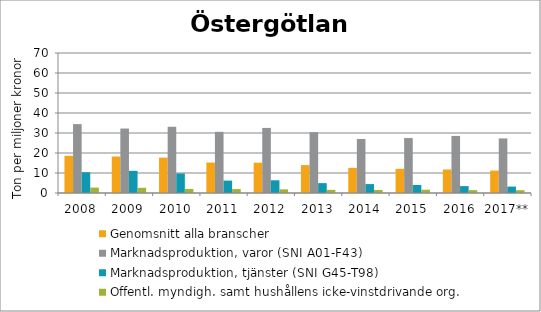
| Category | Genomsnitt alla branscher | Marknadsproduktion, varor (SNI A01-F43) | Marknadsproduktion, tjänster (SNI G45-T98) | Offentl. myndigh. samt hushållens icke-vinstdrivande org. |
|---|---|---|---|---|
| 2008 | 18.607 | 34.447 | 10.396 | 2.703 |
| 2009 | 18.244 | 32.229 | 11.085 | 2.61 |
| 2010 | 17.69 | 33.114 | 9.784 | 2.023 |
| 2011 | 15.23 | 30.583 | 6.197 | 1.975 |
| 2012 | 15.149 | 32.537 | 6.356 | 1.814 |
| 2013 | 13.944 | 30.435 | 4.934 | 1.583 |
| 2014 | 12.571 | 27.001 | 4.464 | 1.518 |
| 2015 | 12.081 | 27.482 | 4.006 | 1.646 |
| 2016 | 11.753 | 28.535 | 3.451 | 1.427 |
| 2017** | 11.201 | 27.287 | 3.21 | 1.406 |